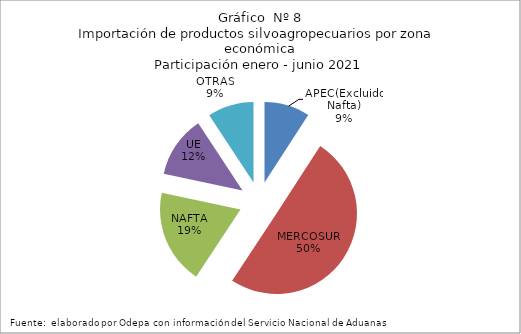
| Category | Series 0 |
|---|---|
| APEC(Excluido Nafta) | 385775.989 |
| MERCOSUR | 2118561.946 |
| NAFTA | 803382.238 |
| UE | 524447.295 |
| OTRAS | 391397.532 |